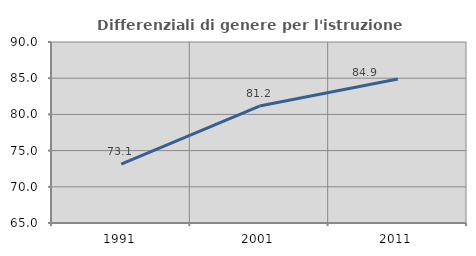
| Category | Differenziali di genere per l'istruzione superiore |
|---|---|
| 1991.0 | 73.134 |
| 2001.0 | 81.15 |
| 2011.0 | 84.884 |